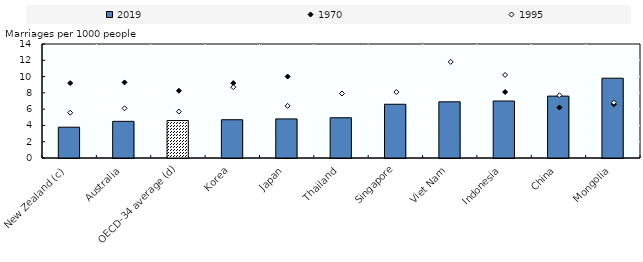
| Category | 2019 |
|---|---|
| New Zealand (c) | 3.784 |
| Australia | 4.5 |
| OECD-34 average (d) | 4.6 |
| Korea | 4.7 |
| Japan | 4.8 |
| Thailand | 4.941 |
| Singapore | 6.6 |
| Viet Nam | 6.9 |
| Indonesia | 7 |
| China | 7.6 |
| Mongolia | 9.8 |